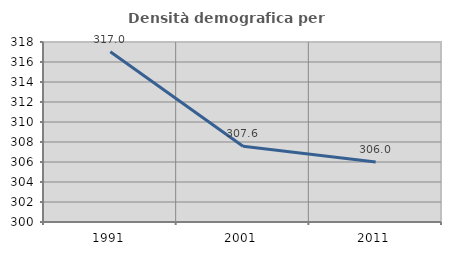
| Category | Densità demografica |
|---|---|
| 1991.0 | 317.02 |
| 2001.0 | 307.57 |
| 2011.0 | 305.989 |